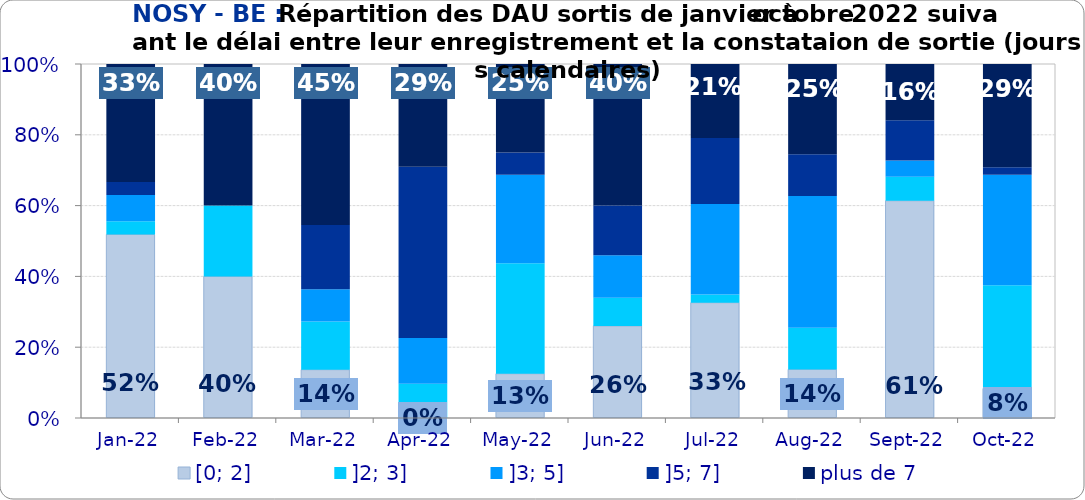
| Category | [0; 2] | ]2; 3] | ]3; 5] | ]5; 7] | plus de 7 |
|---|---|---|---|---|---|
| 2022-01-01 | 0.519 | 0.037 | 0.074 | 0.037 | 0.333 |
| 2022-02-01 | 0.4 | 0.2 | 0 | 0 | 0.4 |
| 2022-03-01 | 0.136 | 0.136 | 0.091 | 0.182 | 0.455 |
| 2022-04-01 | 0 | 0.097 | 0.129 | 0.484 | 0.29 |
| 2022-05-01 | 0.125 | 0.312 | 0.25 | 0.062 | 0.25 |
| 2022-06-01 | 0.26 | 0.08 | 0.12 | 0.14 | 0.4 |
| 2022-07-01 | 0.326 | 0.023 | 0.256 | 0.186 | 0.209 |
| 2022-08-01 | 0.137 | 0.118 | 0.373 | 0.118 | 0.255 |
| 2022-09-01 | 0.614 | 0.068 | 0.045 | 0.114 | 0.159 |
| 2022-10-01 | 0.083 | 0.292 | 0.312 | 0.021 | 0.292 |